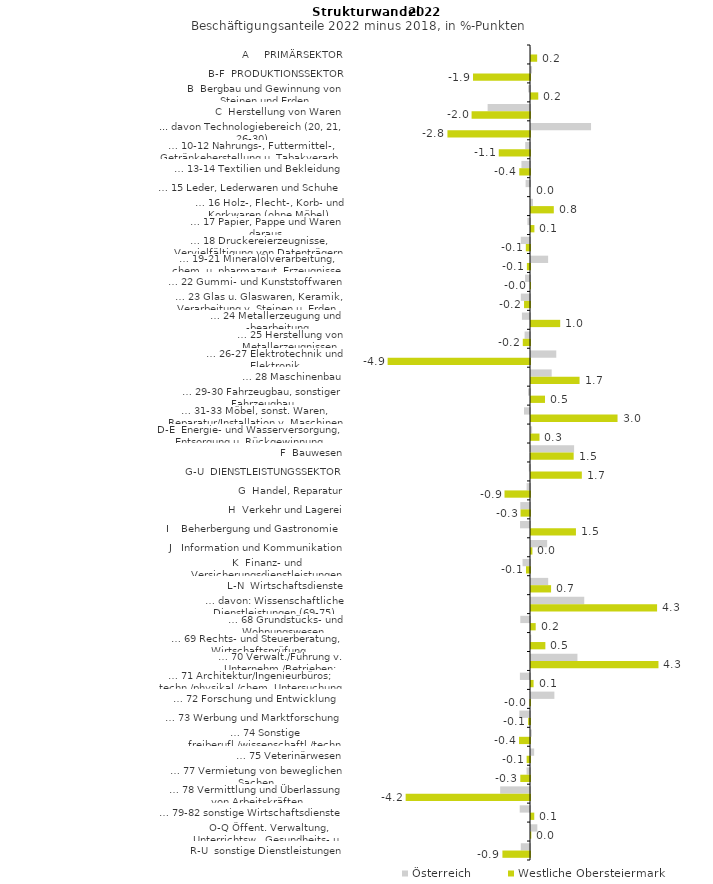
| Category | Österreich | Westliche Obersteiermark |
|---|---|---|
| A     PRIMÄRSEKTOR | 0.004 | 0.21 |
| B-F  PRODUKTIONSSEKTOR | 0.036 | -1.943 |
| B  Bergbau und Gewinnung von Steinen und Erden | -0.063 | 0.247 |
| C  Herstellung von Waren | -1.445 | -1.991 |
| ... davon Technologiebereich (20, 21, 26-30) | 2.047 | -2.814 |
| … 10-12 Nahrungs-, Futtermittel-, Getränkeherstellung u. Tabakverarb. | -0.163 | -1.065 |
| … 13-14 Textilien und Bekleidung | -0.292 | -0.366 |
| … 15 Leder, Lederwaren und Schuhe | -0.15 | 0 |
| … 16 Holz-, Flecht-, Korb- und Korkwaren (ohne Möbel)  | 0.068 | 0.777 |
| … 17 Papier, Pappe und Waren daraus  | -0.09 | 0.116 |
| … 18 Druckereierzeugnisse, Vervielfältigung von Datenträgern | -0.314 | -0.142 |
| … 19-21 Mineralölverarbeitung, chem. u. pharmazeut. Erzeugnisse | 0.584 | -0.106 |
| … 22 Gummi- und Kunststoffwaren | -0.168 | -0.002 |
| … 23 Glas u. Glaswaren, Keramik, Verarbeitung v. Steinen u. Erden  | -0.312 | -0.203 |
| … 24 Metallerzeugung und -bearbeitung | -0.276 | 0.995 |
| … 25 Herstellung von Metallerzeugnissen  | -0.185 | -0.246 |
| … 26-27 Elektrotechnik und Elektronik | 0.862 | -4.854 |
| … 28 Maschinenbau | 0.705 | 1.655 |
| … 29-30 Fahrzeugbau, sonstiger Fahrzeugbau | -0.066 | 0.477 |
| … 31-33 Möbel, sonst. Waren, Reparatur/Installation v. Maschinen | -0.204 | 2.95 |
| D-E  Energie- und Wasserversorgung, Entsorgung u. Rückgewinnung | 0.038 | 0.289 |
| F  Bauwesen | 1.469 | 1.455 |
| G-U  DIENSTLEISTUNGSSEKTOR | -0.04 | 1.733 |
| G  Handel, Reparatur | -0.115 | -0.869 |
| H  Verkehr und Lagerei | -0.33 | -0.322 |
| I    Beherbergung und Gastronomie | -0.34 | 1.532 |
| J   Information und Kommunikation | 0.551 | 0.048 |
| K  Finanz- und Versicherungsdienstleistungen | -0.255 | -0.136 |
| L-N  Wirtschaftsdienste | 0.586 | 0.684 |
| … davon: Wissenschaftliche Dienstleistungen (69-75) | 1.815 | 4.298 |
| … 68 Grundstücks- und Wohnungswesen  | -0.331 | 0.16 |
| … 69 Rechts- und Steuerberatung, Wirtschaftsprüfung | 0.008 | 0.49 |
| … 70 Verwalt./Führung v. Unternehm./Betrieben; Unternehmensberat. | 1.583 | 4.345 |
| … 71 Architektur/Ingenieurbüros; techn./physikal./chem. Untersuchung | -0.344 | 0.088 |
| … 72 Forschung und Entwicklung  | 0.797 | -0.021 |
| … 73 Werbung und Marktforschung | -0.361 | -0.064 |
| … 74 Sonstige freiberufl./wissenschaftl./techn. Tätigkeiten | 0.025 | -0.374 |
| … 75 Veterinärwesen | 0.108 | -0.114 |
| … 77 Vermietung von beweglichen Sachen  | -0.116 | -0.331 |
| … 78 Vermittlung und Überlassung von Arbeitskräften | -1.018 | -4.239 |
| … 79-82 sonstige Wirtschaftsdienste | -0.351 | 0.111 |
| O-Q Öffent. Verwaltung, Unterrichtsw., Gesundheits- u. Sozialwesen | 0.216 | 0.009 |
| R-U  sonstige Dienstleistungen | -0.314 | -0.941 |